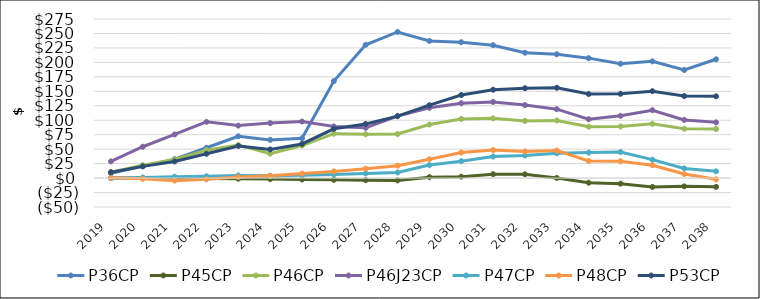
| Category | P36CP | P45CP | P46CP | P46J23CP | P47CP | P48CP | P53CP |
|---|---|---|---|---|---|---|---|
| 2019.0 | 8.441 | 0 | 10.31 | 28.84 | 0.234 | 0.572 | 10.101 |
| 2020.0 | 20.58 | -0.068 | 22.406 | 54.145 | 1.017 | -1.371 | 20.246 |
| 2021.0 | 32.743 | -0.11 | 32.044 | 75.379 | 2.275 | -4.404 | 28.802 |
| 2022.0 | 52.44 | -0.776 | 48.249 | 97.143 | 3.122 | -2.067 | 42.009 |
| 2023.0 | 72.32 | -1.053 | 57.123 | 90.699 | 4.591 | 1.949 | 55.59 |
| 2024.0 | 66.024 | -1.786 | 42.258 | 95.053 | 4.116 | 3.838 | 49.506 |
| 2025.0 | 68.797 | -2.425 | 56.245 | 97.775 | 4.743 | 7.742 | 59.02 |
| 2026.0 | 167.701 | -3.09 | 76.747 | 89.297 | 6.263 | 11.533 | 85.151 |
| 2027.0 | 230.441 | -3.653 | 75.768 | 86.875 | 8.056 | 16.297 | 93.639 |
| 2028.0 | 252.582 | -4.019 | 76.157 | 107.242 | 9.687 | 21.353 | 107.057 |
| 2029.0 | 237.114 | 1.567 | 92.531 | 121.459 | 22.491 | 32.619 | 125.997 |
| 2030.0 | 234.84 | 2.418 | 102.23 | 129.405 | 29.278 | 44.218 | 143.539 |
| 2031.0 | 229.686 | 6.719 | 103.294 | 131.614 | 37.166 | 48.356 | 152.737 |
| 2032.0 | 216.697 | 6.534 | 98.749 | 126.139 | 39.048 | 45.897 | 155.314 |
| 2033.0 | 214.07 | 0.203 | 99.7 | 119.129 | 42.88 | 47.535 | 156.145 |
| 2034.0 | 207.334 | -7.986 | 88.836 | 101.673 | 44.089 | 29.569 | 145.279 |
| 2035.0 | 197.657 | -9.634 | 89.295 | 107.596 | 45.062 | 28.984 | 145.735 |
| 2036.0 | 201.754 | -15.257 | 93.756 | 117.352 | 31.843 | 22.256 | 150.194 |
| 2037.0 | 186.901 | -14.316 | 85.304 | 100.532 | 16.719 | 6.941 | 141.741 |
| 2038.0 | 205.405 | -15.203 | 84.836 | 96.306 | 11.644 | -2.064 | 141.274 |